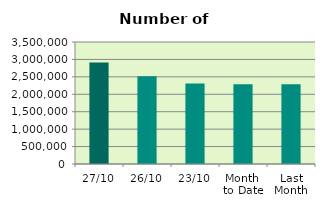
| Category | Series 0 |
|---|---|
| 27/10 | 2911788 |
| 26/10 | 2517492 |
| 23/10 | 2311124 |
| Month 
to Date | 2290981.368 |
| Last
Month | 2288803 |